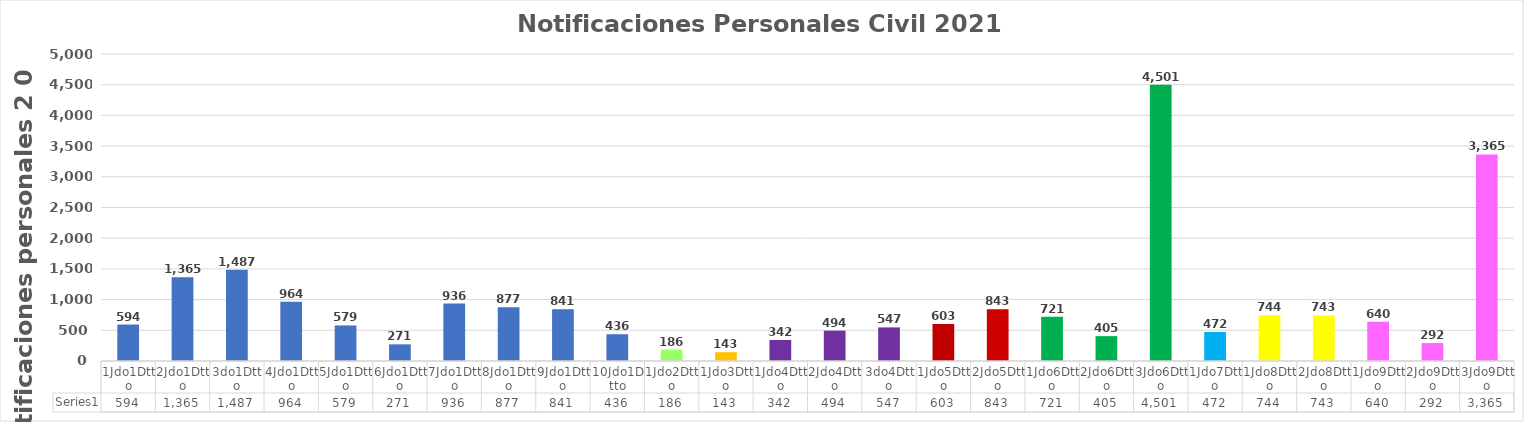
| Category | Series 0 |
|---|---|
| 1Jdo1Dtto | 594 |
| 2Jdo1Dtto | 1365 |
| 3do1Dtto | 1487 |
| 4Jdo1Dtto | 964 |
| 5Jdo1Dtto | 579 |
| 6Jdo1Dtto | 271 |
| 7Jdo1Dtto | 936 |
| 8Jdo1Dtto | 877 |
| 9Jdo1Dtto | 841 |
| 10Jdo1Dtto | 436 |
| 1Jdo2Dtto | 186 |
| 1Jdo3Dtto | 143 |
| 1Jdo4Dtto | 342 |
| 2Jdo4Dtto | 494 |
| 3do4Dtto | 547 |
| 1Jdo5Dtto | 603 |
| 2Jdo5Dtto | 843 |
| 1Jdo6Dtto | 721 |
| 2Jdo6Dtto | 405 |
| 3Jdo6Dtto | 4501 |
| 1Jdo7Dtto | 472 |
| 1Jdo8Dtto | 744 |
| 2Jdo8Dtto | 743 |
| 1Jdo9Dtto | 640 |
| 2Jdo9Dtto | 292 |
| 3Jdo9Dtto | 3365 |